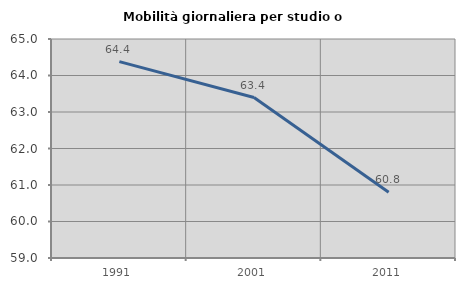
| Category | Mobilità giornaliera per studio o lavoro |
|---|---|
| 1991.0 | 64.379 |
| 2001.0 | 63.397 |
| 2011.0 | 60.802 |